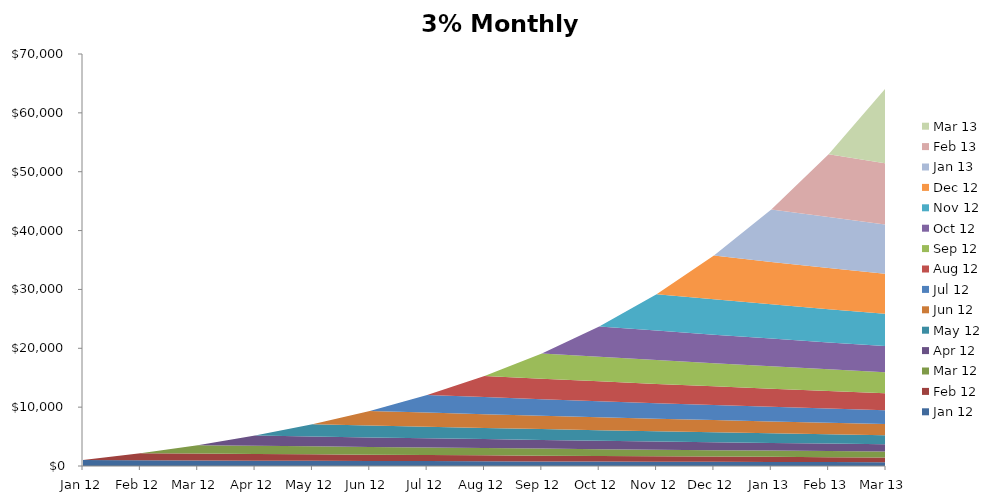
| Category | Jan 12 | Feb 12 | Mar 12 | Apr 12 | May 12 | Jun 12 | Jul 12 | Aug 12 | Sep 12 | Oct 12 | Nov 12 | Dec 12 | Jan 13 | Feb 13 | Mar 13 |
|---|---|---|---|---|---|---|---|---|---|---|---|---|---|---|---|
| Jan 12 | 1000 | 0 | 0 | 0 | 0 | 0 | 0 | 0 | 0 | 0 | 0 | 0 | 0 | 0 | 0 |
| Feb 12 | 970 | 1200 | 0 | 0 | 0 | 0 | 0 | 0 | 0 | 0 | 0 | 0 | 0 | 0 | 0 |
| Mar 12 | 940.9 | 1164 | 1440 | 0 | 0 | 0 | 0 | 0 | 0 | 0 | 0 | 0 | 0 | 0 | 0 |
| Apr 12 | 912.673 | 1129.08 | 1396.8 | 1728 | 0 | 0 | 0 | 0 | 0 | 0 | 0 | 0 | 0 | 0 | 0 |
| May 12 | 885.293 | 1095.208 | 1354.896 | 1676.16 | 2073.6 | 0 | 0 | 0 | 0 | 0 | 0 | 0 | 0 | 0 | 0 |
| Jun 12 | 858.734 | 1062.351 | 1314.249 | 1625.875 | 2011.392 | 2488.32 | 0 | 0 | 0 | 0 | 0 | 0 | 0 | 0 | 0 |
| Jul 12 | 832.972 | 1030.481 | 1274.822 | 1577.099 | 1951.05 | 2413.67 | 2985.984 | 0 | 0 | 0 | 0 | 0 | 0 | 0 | 0 |
| Aug 12 | 807.983 | 999.566 | 1236.577 | 1529.786 | 1892.519 | 2341.26 | 2896.404 | 3583.181 | 0 | 0 | 0 | 0 | 0 | 0 | 0 |
| Sep 12 | 783.743 | 969.579 | 1199.48 | 1483.892 | 1835.743 | 2271.022 | 2809.512 | 3475.685 | 4299.817 | 0 | 0 | 0 | 0 | 0 | 0 |
| Oct 12 | 760.231 | 940.492 | 1163.495 | 1439.376 | 1780.671 | 2202.892 | 2725.227 | 3371.415 | 4170.822 | 5159.78 | 0 | 0 | 0 | 0 | 0 |
| Nov 12 | 737.424 | 912.277 | 1128.59 | 1396.194 | 1727.251 | 2136.805 | 2643.47 | 3270.272 | 4045.698 | 5004.987 | 6191.736 | 0 | 0 | 0 | 0 |
| Dec 12 | 715.301 | 884.909 | 1094.733 | 1354.309 | 1675.433 | 2072.701 | 2564.166 | 3172.164 | 3924.327 | 4854.837 | 6005.984 | 7430.084 | 0 | 0 | 0 |
| Jan 13 | 693.842 | 858.362 | 1061.891 | 1313.679 | 1625.17 | 2010.52 | 2487.241 | 3076.999 | 3806.597 | 4709.192 | 5825.805 | 7207.181 | 8916.1 | 0 | 0 |
| Feb 13 | 673.027 | 832.611 | 1030.034 | 1274.269 | 1576.415 | 1950.204 | 2412.624 | 2984.689 | 3692.399 | 4567.916 | 5651.031 | 6990.966 | 8648.617 | 10699.321 | 0 |
| Mar 13 | 652.836 | 807.633 | 999.133 | 1236.041 | 1529.123 | 1891.698 | 2340.245 | 2895.149 | 3581.627 | 4430.879 | 5481.5 | 6781.237 | 8389.159 | 10378.341 | 12839.185 |